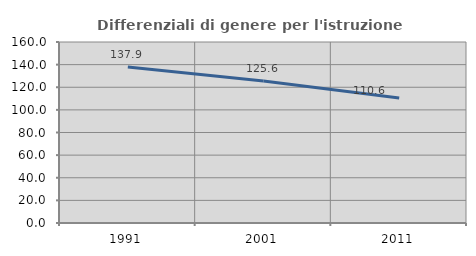
| Category | Differenziali di genere per l'istruzione superiore |
|---|---|
| 1991.0 | 137.896 |
| 2001.0 | 125.562 |
| 2011.0 | 110.569 |